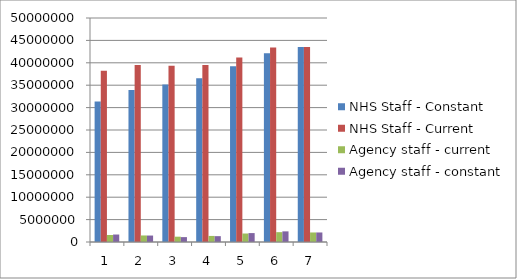
| Category | NHS Staff - Constant | NHS Staff - Current | Agency staff - current | Agency staff - constant |
|---|---|---|---|---|
| 0 | 31334252.48 | 38212088 | 1557282.449 | 1669078 |
| 1 | 33926746.315 | 39516362 | 1459935.5 | 1440740 |
| 2 | 35177509.125 | 39359457 | 1185244 | 1089513 |
| 3 | 36539983.702 | 39525586 | 1354520.298 | 1305572 |
| 4 | 39213453.649 | 41200614 | 1895451.884 | 1988902 |
| 5 | 42145100.102 | 43406879 | 2195295.391 | 2373791 |
| 6 | 43513839 | 43513839 | 2127889 | 2127889 |